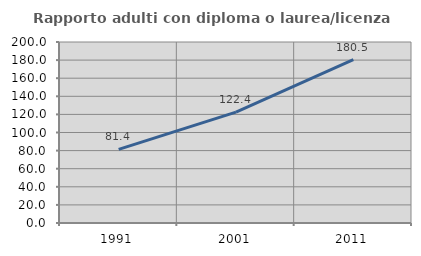
| Category | Rapporto adulti con diploma o laurea/licenza media  |
|---|---|
| 1991.0 | 81.358 |
| 2001.0 | 122.438 |
| 2011.0 | 180.549 |